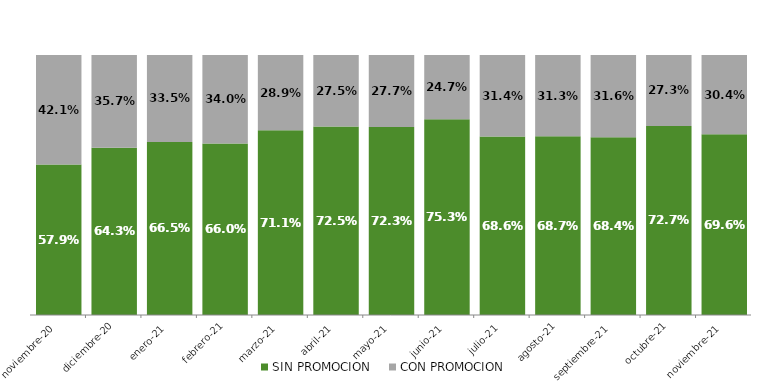
| Category | SIN PROMOCION   | CON PROMOCION   |
|---|---|---|
| 2020-11-01 | 0.579 | 0.421 |
| 2020-12-01 | 0.643 | 0.357 |
| 2021-01-01 | 0.665 | 0.335 |
| 2021-02-01 | 0.66 | 0.34 |
| 2021-03-01 | 0.711 | 0.289 |
| 2021-04-01 | 0.725 | 0.275 |
| 2021-05-01 | 0.723 | 0.277 |
| 2021-06-01 | 0.753 | 0.247 |
| 2021-07-01 | 0.686 | 0.314 |
| 2021-08-01 | 0.687 | 0.313 |
| 2021-09-01 | 0.684 | 0.316 |
| 2021-10-01 | 0.727 | 0.273 |
| 2021-11-01 | 0.696 | 0.304 |